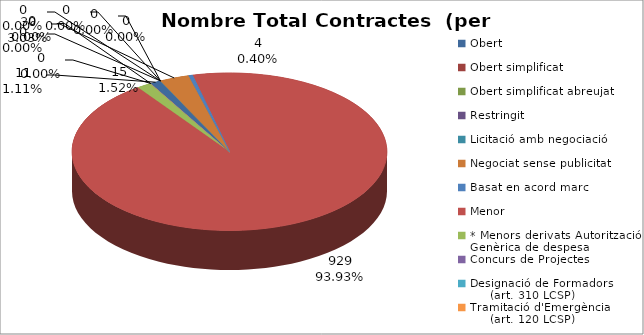
| Category | Nombre Total Contractes |
|---|---|
| Obert | 11 |
| Obert simplificat | 0 |
| Obert simplificat abreujat | 0 |
| Restringit | 0 |
| Licitació amb negociació | 0 |
| Negociat sense publicitat | 30 |
| Basat en acord marc | 4 |
| Menor | 929 |
| * Menors derivats Autorització Genèrica de despesa | 15 |
| Concurs de Projectes | 0 |
| Designació de Formadors
     (art. 310 LCSP) | 0 |
| Tramitació d'Emergència
     (art. 120 LCSP) | 0 |